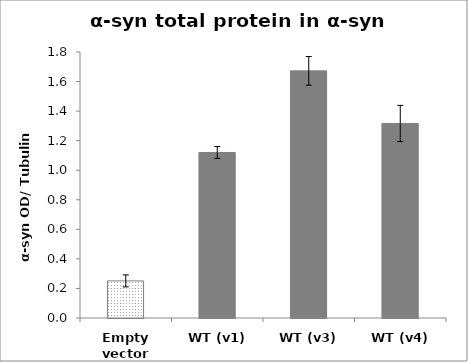
| Category | Series 0 |
|---|---|
| Empty vector | 0.251 |
| WT (v1) | 1.12 |
| WT (v3) | 1.672 |
| WT (v4) | 1.317 |